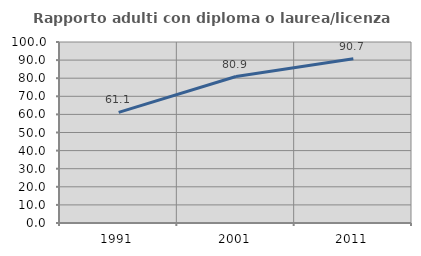
| Category | Rapporto adulti con diploma o laurea/licenza media  |
|---|---|
| 1991.0 | 61.111 |
| 2001.0 | 80.909 |
| 2011.0 | 90.704 |